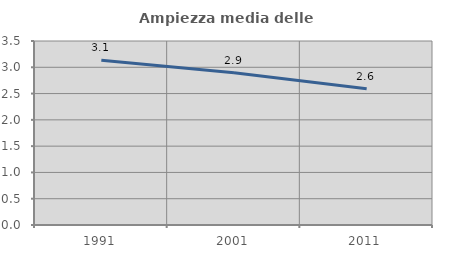
| Category | Ampiezza media delle famiglie |
|---|---|
| 1991.0 | 3.132 |
| 2001.0 | 2.896 |
| 2011.0 | 2.59 |